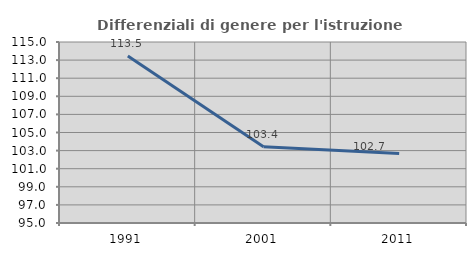
| Category | Differenziali di genere per l'istruzione superiore |
|---|---|
| 1991.0 | 113.455 |
| 2001.0 | 103.413 |
| 2011.0 | 102.672 |